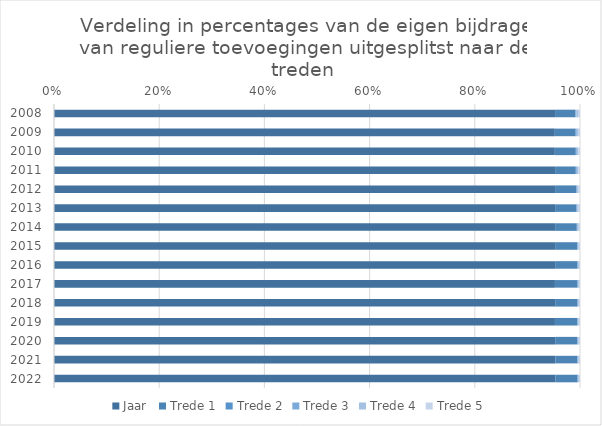
| Category | Jaar  | Trede 1 | Trede 2 | Trede 3 | Trede 4 | Trede 5 |
|---|---|---|---|---|---|---|
| 2008.0 | 2008 | 81 | 2 | 3 | 6 | 8 |
| 2009.0 | 2009 | 83 | 2 | 3 | 5 | 8 |
| 2010.0 | 2010 | 84 | 2 | 3 | 5 | 7 |
| 2011.0 | 2011 | 83 | 2 | 3 | 5 | 7 |
| 2012.0 | 2012 | 85 | 2 | 3 | 4 | 6 |
| 2013.0 | 2013 | 85 | 2 | 3 | 4 | 6 |
| 2014.0 | 2014 | 87 | 2 | 2 | 4 | 5 |
| 2015.0 | 2015 | 89 | 1 | 2 | 3 | 5 |
| 2016.0 | 2016 | 89 | 2 | 2 | 3 | 4 |
| 2017.0 | 2017 | 90 | 2 | 2 | 3 | 4 |
| 2018.0 | 2018 | 90 | 1 | 2 | 3 | 4 |
| 2019.0 | 2019 | 89 | 2 | 2 | 3 | 5 |
| 2020.0 | 2020 | 88 | 2 | 2 | 3 | 5 |
| 2021.0 | 2021 | 88 | 1 | 2 | 3 | 5 |
| 2022.0 | 2022 | 89 | 1 | 2 | 3 | 4 |